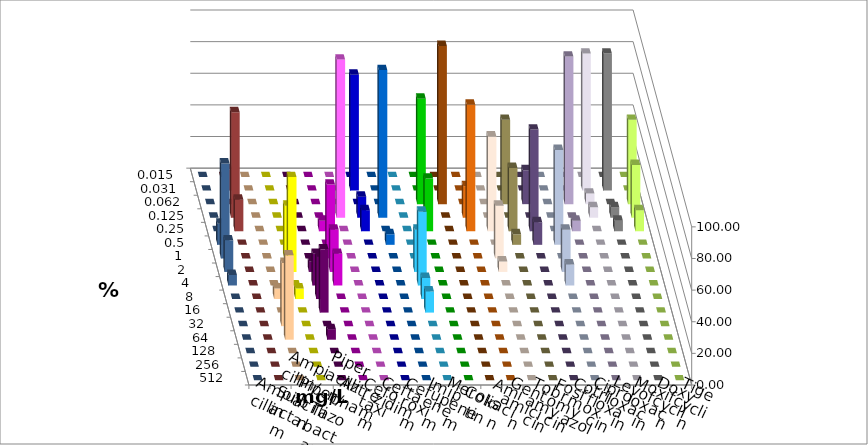
| Category | Ampicillin | Ampicillin/ Sulbactam | Piperacillin | Piperacillin/ Tazobactam | Aztreonam | Cefotaxim | Ceftazidim | Cefuroxim | Imipenem | Meropenem | Colistin | Amikacin | Gentamicin | Tobramycin | Fosfomycin | Cotrimoxazol | Ciprofloxacin | Levofloxacin | Moxifloxacin | Doxycyclin | Tigecyclin |
|---|---|---|---|---|---|---|---|---|---|---|---|---|---|---|---|---|---|---|---|---|---|
| 0.015 | 0 | 0 | 0 | 0 | 0 | 0 | 0 | 0 | 0 | 0 | 0 | 0 | 0 | 0 | 0 | 0 | 0 | 0 | 0 | 0 | 0 |
| 0.031 | 0 | 0 | 0 | 0 | 0 | 73.333 | 0 | 0 | 0 | 0 | 0 | 0 | 0 | 0 | 0 | 0 | 86.667 | 86.667 | 0 | 0 | 13.333 |
| 0.062 | 0 | 0 | 0 | 0 | 0 | 0 | 0 | 0 | 66.667 | 100 | 0 | 0 | 53.333 | 21.429 | 0 | 93.333 | 6.667 | 0 | 53.333 | 0 | 0 |
| 0.125 | 0 | 0 | 0 | 0 | 100 | 13.333 | 93.333 | 0 | 0 | 0 | 20 | 0 | 0 | 0 | 0 | 0 | 6.667 | 6.667 | 33.333 | 0 | 66.667 |
| 0.25 | 0 | 0 | 0 | 6.667 | 0 | 13.333 | 0 | 0 | 33.333 | 0 | 80 | 60 | 40 | 64.286 | 0 | 6.667 | 0 | 6.667 | 13.333 | 0 | 20 |
| 0.5 | 0 | 0 | 0 | 0 | 0 | 0 | 6.667 | 0 | 0 | 0 | 0 | 0 | 6.667 | 14.286 | 60 | 0 | 0 | 0 | 0 | 13.333 | 0 |
| 1.0 | 0 | 33.333 | 0 | 46.667 | 0 | 0 | 0 | 0 | 0 | 0 | 0 | 33.333 | 0 | 0 | 0 | 0 | 0 | 0 | 0 | 60 | 0 |
| 2.0 | 0 | 60 | 6.667 | 26.667 | 0 | 0 | 0 | 26.667 | 0 | 0 | 0 | 6.667 | 0 | 0 | 26.667 | 0 | 0 | 0 | 0 | 20 | 0 |
| 4.0 | 0 | 0 | 20 | 20 | 0 | 0 | 0 | 46.667 | 0 | 0 | 0 | 0 | 0 | 0 | 13.333 | 0 | 0 | 0 | 0 | 6.667 | 0 |
| 8.0 | 6.667 | 6.667 | 26.667 | 0 | 0 | 0 | 0 | 13.333 | 0 | 0 | 0 | 0 | 0 | 0 | 0 | 0 | 0 | 0 | 0 | 0 | 0 |
| 16.0 | 0 | 0 | 40 | 0 | 0 | 0 | 0 | 13.333 | 0 | 0 | 0 | 0 | 0 | 0 | 0 | 0 | 0 | 0 | 0 | 0 | 0 |
| 32.0 | 40 | 0 | 0 | 0 | 0 | 0 | 0 | 0 | 0 | 0 | 0 | 0 | 0 | 0 | 0 | 0 | 0 | 0 | 0 | 0 | 0 |
| 64.0 | 53.333 | 0 | 6.667 | 0 | 0 | 0 | 0 | 0 | 0 | 0 | 0 | 0 | 0 | 0 | 0 | 0 | 0 | 0 | 0 | 0 | 0 |
| 128.0 | 0 | 0 | 0 | 0 | 0 | 0 | 0 | 0 | 0 | 0 | 0 | 0 | 0 | 0 | 0 | 0 | 0 | 0 | 0 | 0 | 0 |
| 256.0 | 0 | 0 | 0 | 0 | 0 | 0 | 0 | 0 | 0 | 0 | 0 | 0 | 0 | 0 | 0 | 0 | 0 | 0 | 0 | 0 | 0 |
| 512.0 | 0 | 0 | 0 | 0 | 0 | 0 | 0 | 0 | 0 | 0 | 0 | 0 | 0 | 0 | 0 | 0 | 0 | 0 | 0 | 0 | 0 |